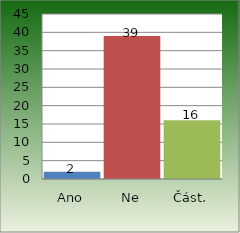
| Category | Series 0 |
|---|---|
| Ano | 2 |
| Ne | 39 |
| Část. | 16 |